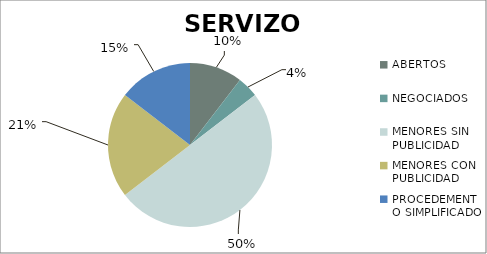
| Category | Series 0 |
|---|---|
| ABERTOS  | 5 |
| NEGOCIADOS  | 2 |
| MENORES SIN PUBLICIDAD | 24 |
| MENORES CON PUBLICIDAD | 10 |
| PROCEDEMENTO SIMPLIFICADO | 7 |